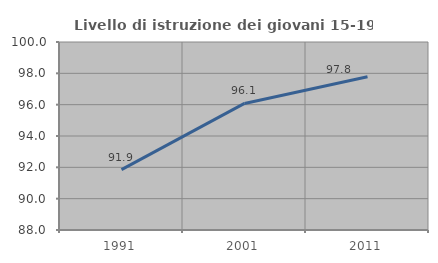
| Category | Livello di istruzione dei giovani 15-19 anni |
|---|---|
| 1991.0 | 91.852 |
| 2001.0 | 96.078 |
| 2011.0 | 97.778 |